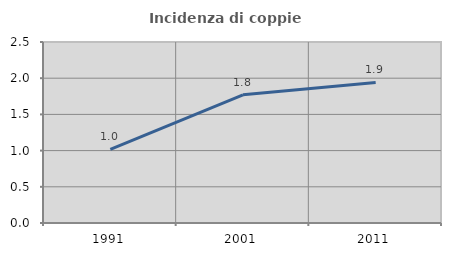
| Category | Incidenza di coppie miste |
|---|---|
| 1991.0 | 1.018 |
| 2001.0 | 1.77 |
| 2011.0 | 1.942 |